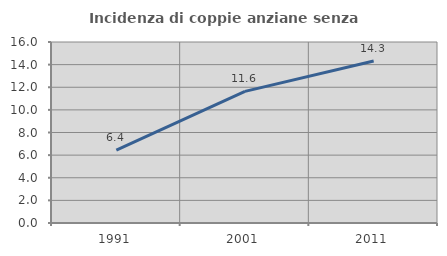
| Category | Incidenza di coppie anziane senza figli  |
|---|---|
| 1991.0 | 6.448 |
| 2001.0 | 11.634 |
| 2011.0 | 14.323 |